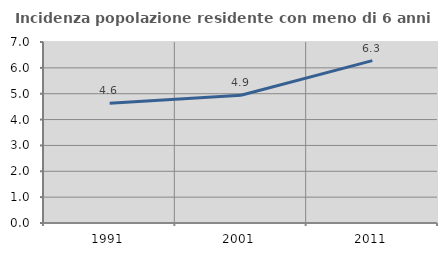
| Category | Incidenza popolazione residente con meno di 6 anni |
|---|---|
| 1991.0 | 4.635 |
| 2001.0 | 4.938 |
| 2011.0 | 6.28 |